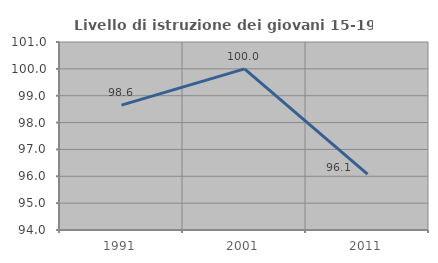
| Category | Livello di istruzione dei giovani 15-19 anni |
|---|---|
| 1991.0 | 98.649 |
| 2001.0 | 100 |
| 2011.0 | 96.078 |